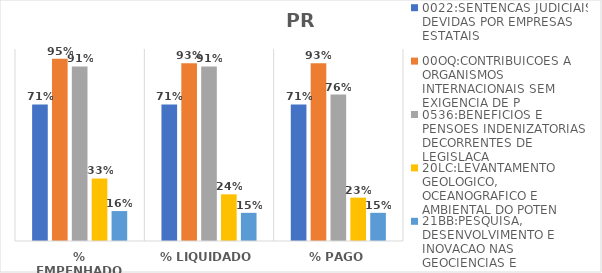
| Category | 0022:SENTENCAS JUDICIAIS DEVIDAS POR EMPRESAS ESTATAIS | 00OQ:CONTRIBUICOES A ORGANISMOS INTERNACIONAIS SEM EXIGENCIA DE P | 0536:BENEFICIOS E PENSOES INDENIZATORIAS DECORRENTES DE LEGISLACA | 20LC:LEVANTAMENTO GEOLOGICO, OCEANOGRAFICO E AMBIENTAL DO POTEN | 21BB:PESQUISA, DESENVOLVIMENTO E INOVACAO NAS GEOCIENCIAS E |
|---|---|---|---|---|---|
| % EMPENHADO | 0.711 | 0.95 | 0.909 | 0.326 | 0.156 |
| % LIQUIDADO | 0.711 | 0.926 | 0.909 | 0.243 | 0.147 |
| % PAGO | 0.711 | 0.926 | 0.763 | 0.226 | 0.147 |